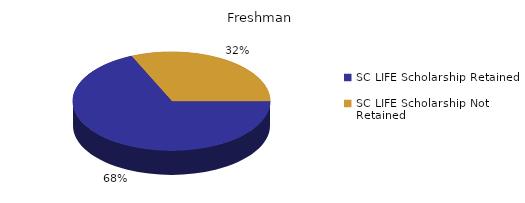
| Category | Freshman |
|---|---|
| SC LIFE Scholarship Retained  | 1391 |
| SC LIFE Scholarship Not Retained  | 645 |